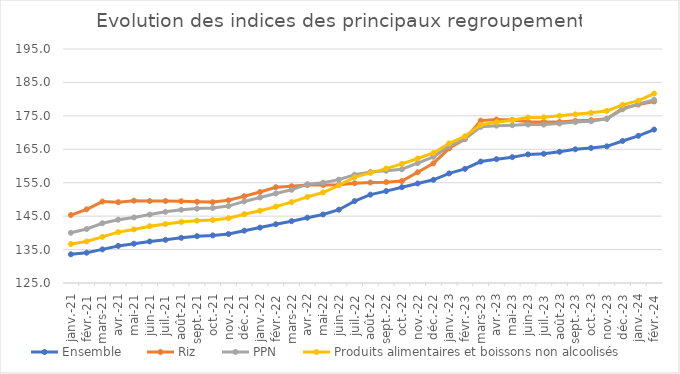
| Category |  Ensemble  |  Riz  |  PPN  |  Produits alimentaires et boissons non alcoolisés  |
|---|---|---|---|---|
| 2021-01-01 | 133.582 | 145.33 | 140.014 | 136.64 |
| 2021-02-01 | 134.068 | 147.047 | 141.147 | 137.422 |
| 2021-03-01 | 135.051 | 149.367 | 142.872 | 138.8 |
| 2021-04-01 | 136.088 | 149.178 | 143.938 | 140.217 |
| 2021-05-01 | 136.75 | 149.619 | 144.606 | 141.028 |
| 2021-06-01 | 137.421 | 149.519 | 145.469 | 142.002 |
| 2021-07-01 | 137.905 | 149.532 | 146.302 | 142.639 |
| 2021-08-01 | 138.51 | 149.461 | 146.899 | 143.242 |
| 2021-09-01 | 139.014 | 149.302 | 147.252 | 143.631 |
| 2021-10-01 | 139.227 | 149.196 | 147.416 | 143.832 |
| 2021-11-01 | 139.66 | 149.736 | 148.006 | 144.381 |
| 2021-12-01 | 140.647 | 150.942 | 149.401 | 145.589 |
| 2022-01-01 | 141.575 | 152.225 | 150.572 | 146.611 |
| 2022-02-01 | 142.565 | 153.658 | 151.785 | 147.854 |
| 2022-03-01 | 143.49 | 153.947 | 152.881 | 149.188 |
| 2022-04-01 | 144.542 | 154.286 | 154.56 | 150.765 |
| 2022-05-01 | 145.5 | 154.308 | 155.011 | 152.074 |
| 2022-06-01 | 146.929 | 154.397 | 155.916 | 154.212 |
| 2022-07-01 | 149.51 | 154.848 | 157.411 | 156.664 |
| 2022-08-01 | 151.429 | 155.056 | 158.224 | 157.93 |
| 2022-09-01 | 152.495 | 155.168 | 158.567 | 159.229 |
| 2022-10-01 | 153.659 | 155.499 | 159.025 | 160.634 |
| 2022-11-01 | 154.778 | 158.112 | 160.842 | 162.244 |
| 2022-12-01 | 155.868 | 160.795 | 162.741 | 163.889 |
| 2023-01-01 | 157.78 | 165.289 | 165.928 | 166.783 |
| 2023-02-01 | 159.146 | 168.082 | 168.07 | 168.879 |
| 2023-03-01 | 161.33 | 173.573 | 171.71 | 172.334 |
| 2023-04-01 | 162.047 | 173.895 | 172.074 | 173.1 |
| 2023-05-01 | 162.649 | 173.786 | 172.207 | 173.691 |
| 2023-06-01 | 163.471 | 173.218 | 172.406 | 174.499 |
| 2023-07-01 | 163.661 | 173.19 | 172.397 | 174.557 |
| 2023-08-01 | 164.258 | 173.164 | 172.694 | 175.026 |
| 2023-09-01 | 164.998 | 173.503 | 173.138 | 175.45 |
| 2023-10-01 | 165.397 | 173.714 | 173.381 | 175.897 |
| 2023-11-01 | 165.874 | 174.101 | 174.147 | 176.454 |
| 2023-12-01 | 167.482 | 177.228 | 176.947 | 178.302 |
| 2024-01-01 | 169.034 | 178.373 | 178.538 | 179.541 |
| 2024-02-01 | 170.899 | 179.307 | 179.782 | 181.683 |